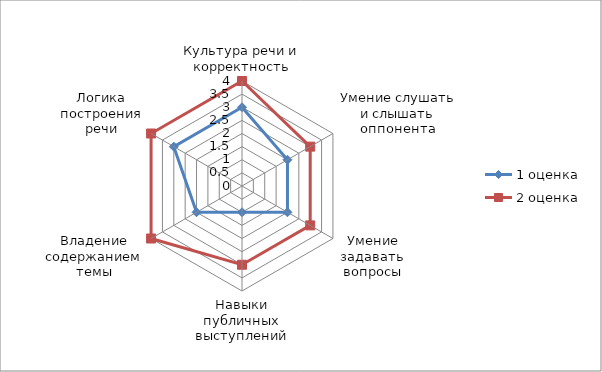
| Category | 1 оценка  | 2 оценка |
|---|---|---|
| Культура речи и корректность | 3 | 4 |
| Умение слушать и слышать оппонента | 2 | 3 |
| Умение задавать вопросы | 2 | 3 |
| Навыки публичных выступлений | 1 | 3 |
| Владение содержанием темы | 2 | 4 |
| Логика построения речи | 3 | 4 |